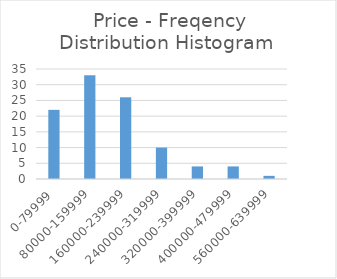
| Category | Count |
|---|---|
| 0-79999 | 22 |
| 80000-159999 | 33 |
| 160000-239999 | 26 |
| 240000-319999 | 10 |
| 320000-399999 | 4 |
| 400000-479999 | 4 |
| 560000-639999 | 1 |